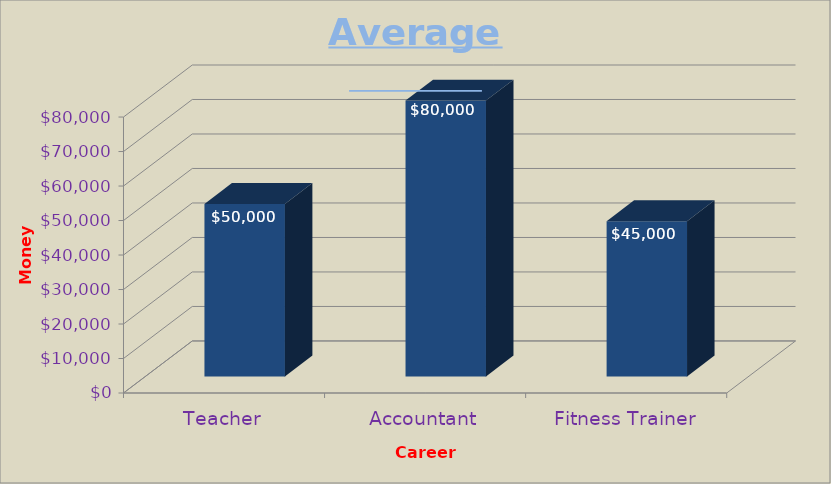
| Category | Average Salary |
|---|---|
| Teacher | 50000 |
| Accountant | 80000 |
| Fitness Trainer | 45000 |